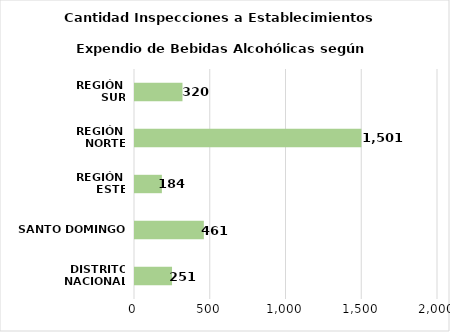
| Category | Series 0 |
|---|---|
| DISTRITO NACIONAL | 251 |
| SANTO DOMINGO | 461 |
| REGIÓN 
ESTE | 184 |
| REGIÓN 
NORTE | 1501 |
| REGIÓN 
SUR | 320 |